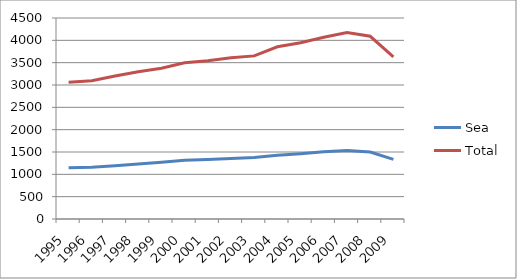
| Category | Sea | Total |
|---|---|---|
| 1995.0 | 1146 | 3060 |
| 1996.0 | 1160 | 3096 |
| 1997.0 | 1193 | 3202 |
| 1998.0 | 1232 | 3297 |
| 1999.0 | 1268 | 3377 |
| 2000.0 | 1314 | 3499 |
| 2001.0 | 1334 | 3544 |
| 2002.0 | 1355 | 3608 |
| 2003.0 | 1378 | 3652 |
| 2004.0 | 1427 | 3856 |
| 2005.0 | 1461 | 3946 |
| 2006.0 | 1505 | 4069 |
| 2007.0 | 1532 | 4175 |
| 2008.0 | 1498 | 4091 |
| 2009.0 | 1336 | 3632 |